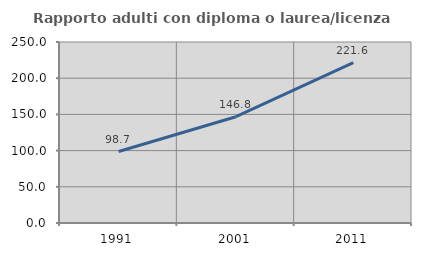
| Category | Rapporto adulti con diploma o laurea/licenza media  |
|---|---|
| 1991.0 | 98.727 |
| 2001.0 | 146.835 |
| 2011.0 | 221.556 |